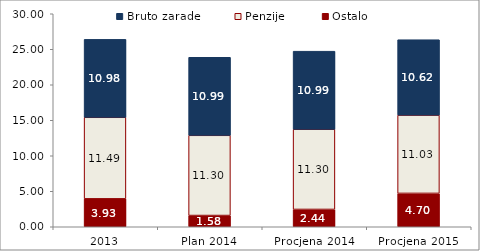
| Category | Ostalo | Penzije | Bruto zarade |
|---|---|---|---|
| 2013 | 3.932 | 11.487 | 10.975 |
| Plan 2014 | 1.58 | 11.3 | 10.992 |
| Procjena 2014 | 2.438 | 11.3 | 10.992 |
| Procjena 2015 | 4.698 | 11.027 | 10.62 |